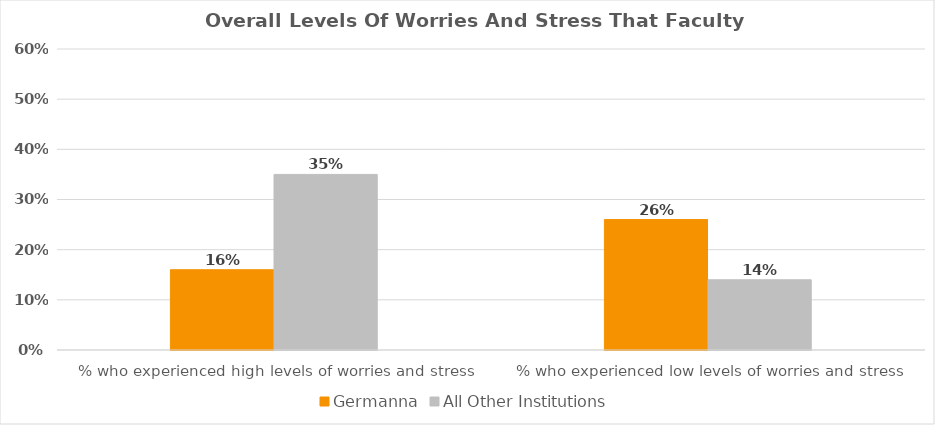
| Category | Germanna | All Other Institutions |
|---|---|---|
| % who experienced high levels of worries and stress | 0.16 | 0.35 |
| % who experienced low levels of worries and stress | 0.26 | 0.14 |